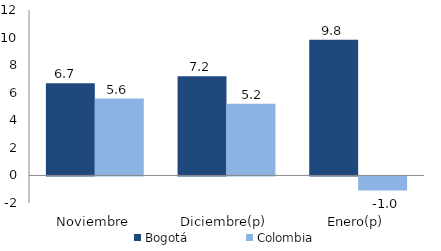
| Category | Bogotá | Colombia |
|---|---|---|
| Noviembre | 6.686 | 5.577 |
| Diciembre(p) | 7.2 | 5.2 |
| Enero(p) | 9.834 | -1.029 |